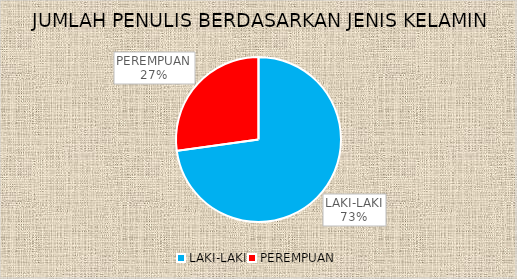
| Category | Series 0 |
|---|---|
| LAKI-LAKI | 91 |
| PEREMPUAN | 34 |